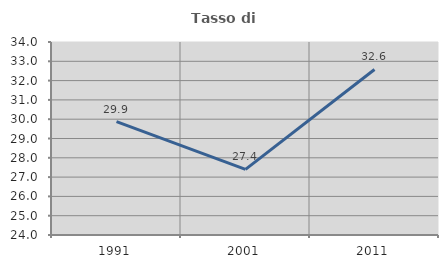
| Category | Tasso di occupazione   |
|---|---|
| 1991.0 | 29.874 |
| 2001.0 | 27.402 |
| 2011.0 | 32.576 |